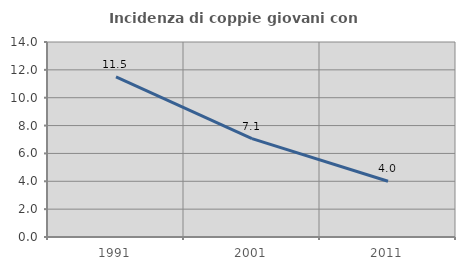
| Category | Incidenza di coppie giovani con figli |
|---|---|
| 1991.0 | 11.494 |
| 2001.0 | 7.059 |
| 2011.0 | 4 |